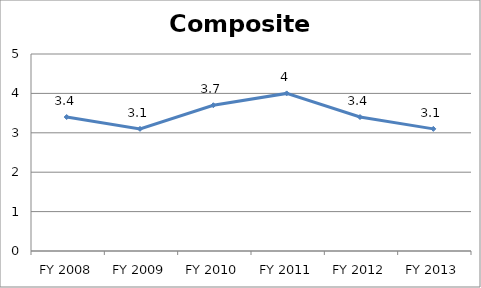
| Category | Composite score |
|---|---|
| FY 2013 | 3.1 |
| FY 2012 | 3.4 |
| FY 2011 | 4 |
| FY 2010 | 3.7 |
| FY 2009 | 3.1 |
| FY 2008 | 3.4 |